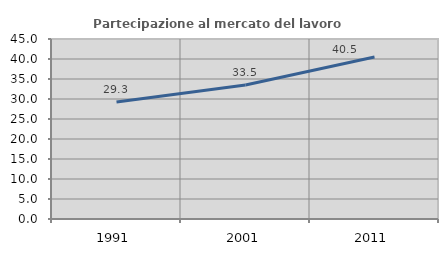
| Category | Partecipazione al mercato del lavoro  femminile |
|---|---|
| 1991.0 | 29.257 |
| 2001.0 | 33.522 |
| 2011.0 | 40.503 |